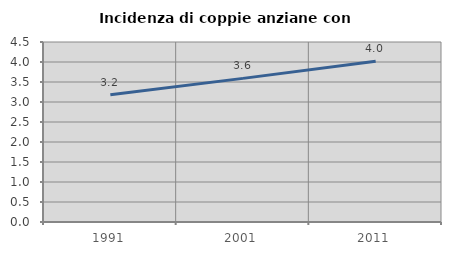
| Category | Incidenza di coppie anziane con figli |
|---|---|
| 1991.0 | 3.18 |
| 2001.0 | 3.59 |
| 2011.0 | 4.018 |